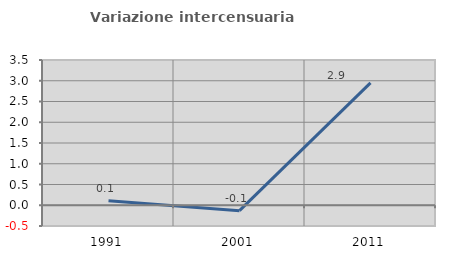
| Category | Variazione intercensuaria annua |
|---|---|
| 1991.0 | 0.108 |
| 2001.0 | -0.131 |
| 2011.0 | 2.949 |